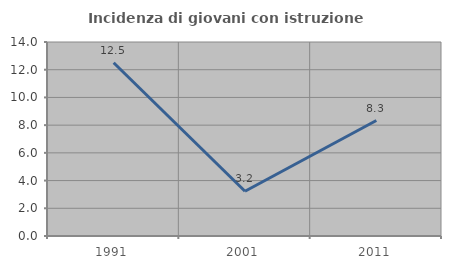
| Category | Incidenza di giovani con istruzione universitaria |
|---|---|
| 1991.0 | 12.5 |
| 2001.0 | 3.226 |
| 2011.0 | 8.333 |